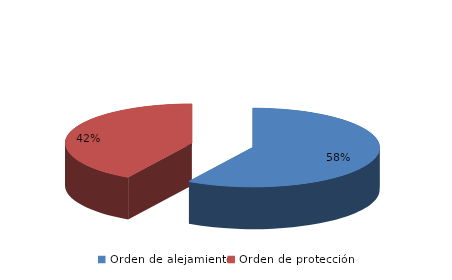
| Category | Series 0 |
|---|---|
| Orden de alejamiento | 1108 |
| Orden de protección | 790 |